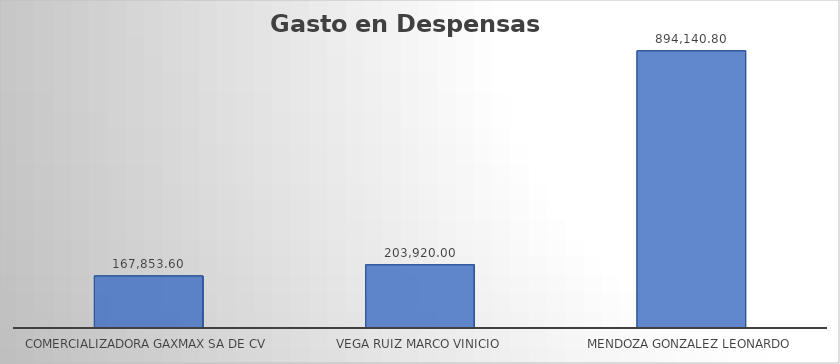
| Category | Suma |
|---|---|
| COMERCIALIZADORA GAXMAX SA DE CV | 167853.6 |
| VEGA RUIZ MARCO VINICIO | 203920 |
| MENDOZA GONZALEZ LEONARDO | 894140.8 |